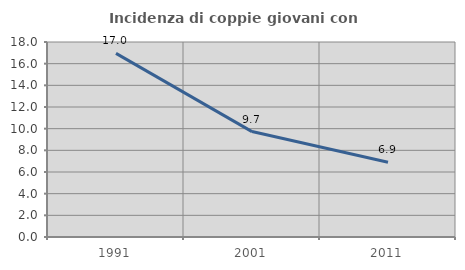
| Category | Incidenza di coppie giovani con figli |
|---|---|
| 1991.0 | 16.951 |
| 2001.0 | 9.731 |
| 2011.0 | 6.908 |